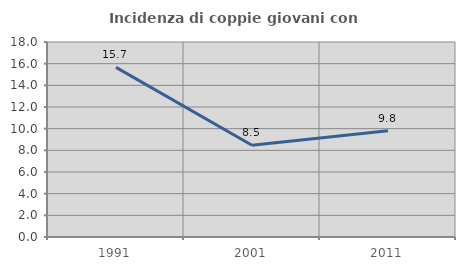
| Category | Incidenza di coppie giovani con figli |
|---|---|
| 1991.0 | 15.657 |
| 2001.0 | 8.475 |
| 2011.0 | 9.804 |